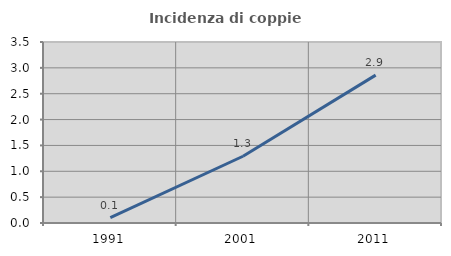
| Category | Incidenza di coppie miste |
|---|---|
| 1991.0 | 0.104 |
| 2001.0 | 1.291 |
| 2011.0 | 2.859 |